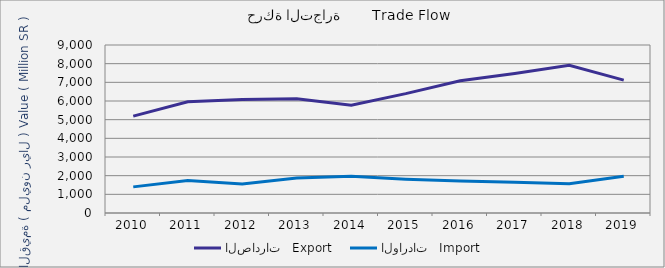
| Category | الصادرات   Export | الواردات   Import |
|---|---|---|
| 2010.0 | 5188715069 | 1399500142 |
| 2011.0 | 5954265686 | 1738299917 |
| 2012.0 | 6078043932 | 1555730077 |
| 2013.0 | 6118768859 | 1876194268 |
| 2014.0 | 5770260738 | 1964517405 |
| 2015.0 | 6393984578 | 1813283591 |
| 2016.0 | 7089084043 | 1710261712 |
| 2017.0 | 7476728984 | 1648376615 |
| 2018.0 | 7914869333 | 1566591388 |
| 2019.0 | 7121063683 | 1965602780 |